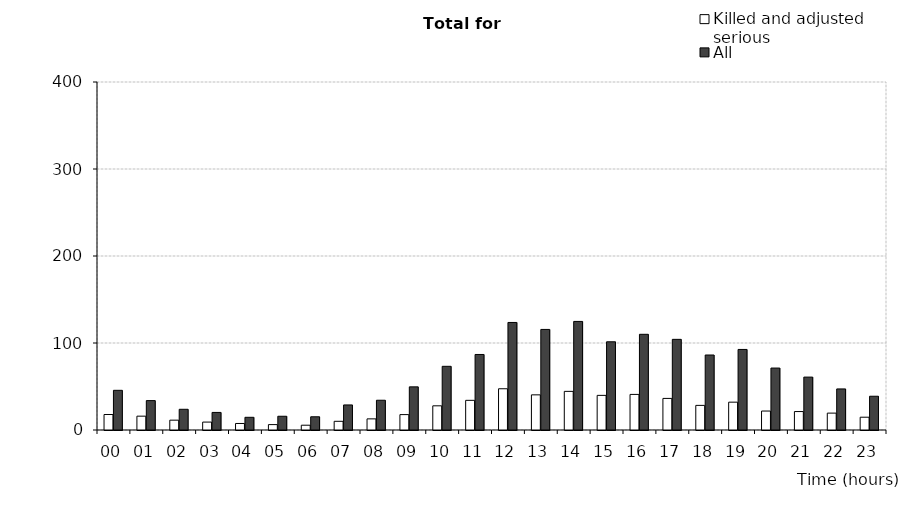
| Category | Killed and adjusted serious | All |
|---|---|---|
| 00 | 17.8 | 45.6 |
| 01 | 15.9 | 33.8 |
| 02 | 11.3 | 23.8 |
| 03 | 9.1 | 20.2 |
| 04 | 7.5 | 14.6 |
| 05 | 6.2 | 15.8 |
| 06 | 5.5 | 15.2 |
| 07 | 10 | 28.8 |
| 08 | 12.8 | 34.2 |
| 09 | 17.7 | 49.6 |
| 10 | 27.8 | 73.2 |
| 11 | 34.1 | 86.8 |
| 12 | 47.4 | 123.6 |
| 13 | 40.4 | 115.6 |
| 14 | 44.4 | 124.8 |
| 15 | 39.8 | 101.4 |
| 16 | 40.9 | 110 |
| 17 | 36.3 | 104.2 |
| 18 | 28.3 | 86.2 |
| 19 | 32 | 92.6 |
| 20 | 21.8 | 71.2 |
| 21 | 21.2 | 60.8 |
| 22 | 19.4 | 47.2 |
| 23 | 14.7 | 38.8 |